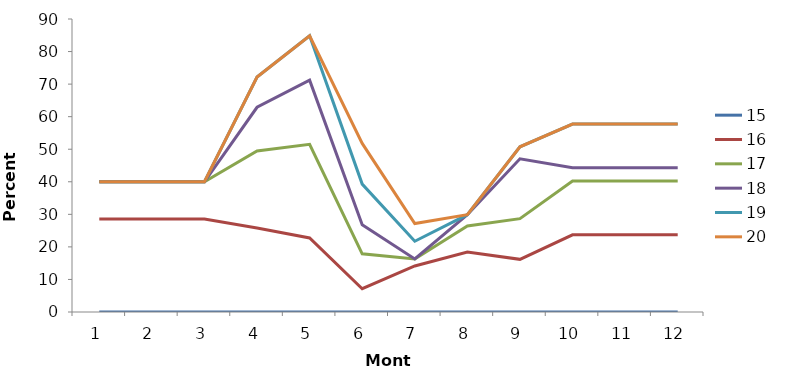
| Category | 15 | 16 | 17 | 18 | 19 | 20 |
|---|---|---|---|---|---|---|
| 1.0 | 0 | 28.571 | 40 | 40 | 40 | 40 |
| 2.0 | 0 | 28.571 | 40 | 40 | 40 | 40 |
| 3.0 | 0 | 28.571 | 40 | 40 | 40 | 40 |
| 4.0 | 0 | 25.773 | 49.485 | 62.887 | 72.165 | 72.165 |
| 5.0 | 0 | 22.727 | 51.515 | 71.212 | 84.848 | 84.848 |
| 6.0 | 0 | 7.143 | 17.857 | 26.786 | 39.286 | 51.786 |
| 7.0 | 0 | 14.13 | 16.304 | 16.304 | 21.739 | 27.174 |
| 8.0 | 0 | 18.391 | 26.437 | 29.885 | 29.885 | 29.885 |
| 9.0 | 0 | 16.176 | 28.676 | 47.059 | 50.735 | 50.735 |
| 10.0 | 0 | 23.711 | 40.206 | 44.33 | 57.732 | 57.732 |
| 11.0 | 0 | 23.711 | 40.206 | 44.33 | 57.732 | 57.732 |
| 12.0 | 0 | 23.711 | 40.206 | 44.33 | 57.732 | 57.732 |